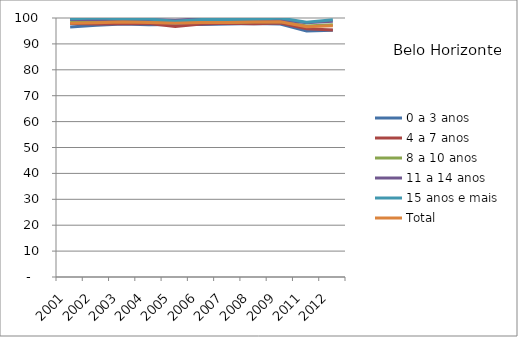
| Category | 0 a 3 anos | 4 a 7 anos | 8 a 10 anos | 11 a 14 anos | 15 anos e mais | Total |
|---|---|---|---|---|---|---|
| 2001.0 | 96.55 | 97.88 | 98.79 | 99.4 | 99.69 | 97.97 |
| 2002.0 | 97.22 | 97.7 | 98.7 | 99.38 | 100 | 98.16 |
| 2003.0 | 97.65 | 97.79 | 99.05 | 99.64 | 99.71 | 98.44 |
| 2004.0 | 97.41 | 97.84 | 98.81 | 99.4 | 99.59 | 98.28 |
| 2005.0 | 97.49 | 96.72 | 98.86 | 99.15 | 98.75 | 97.96 |
| 2006.0 | 97.46 | 97.69 | 98.27 | 99.7 | 99.42 | 98.3 |
| 2007.0 | 97.67 | 97.93 | 98.23 | 99.03 | 99.44 | 98.27 |
| 2008.0 | 97.86 | 97.75 | 98.53 | 99.41 | 99.49 | 98.46 |
| 2009.0 | 97.66 | 98.04 | 98.65 | 99.29 | 100 | 98.52 |
| 2011.0 | 95.01 | 95.87 | 96.91 | 98.14 | 98.37 | 96.67 |
| 2012.0 | 95.28 | 95.39 | 97.41 | 98.72 | 99.29 | 96.97 |